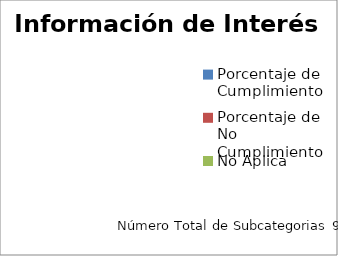
| Category | Información de Interés  |
|---|---|
| Porcentaje de Cumplimiento | 0 |
| Porcentaje de No Cumplimiento | 0 |
| No Aplica | 0 |